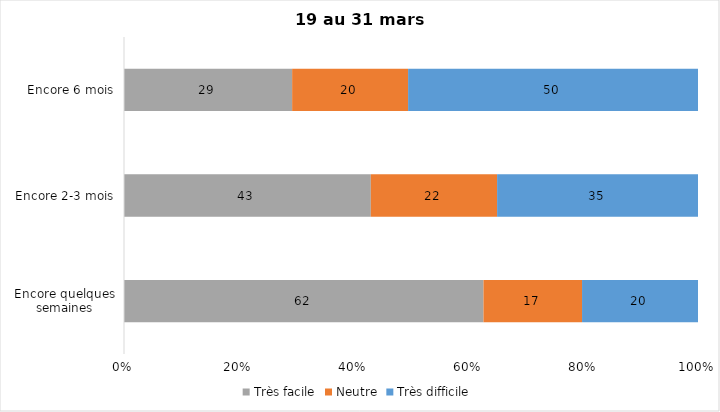
| Category | Très facile | Neutre | Très difficile |
|---|---|---|---|
| Encore quelques semaines | 62 | 17 | 20 |
| Encore 2-3 mois | 43 | 22 | 35 |
| Encore 6 mois | 29 | 20 | 50 |